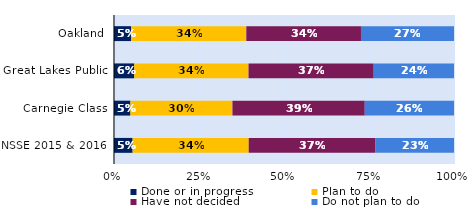
| Category | Done or in progress | Plan to do | Have not decided | Do not plan to do |
|---|---|---|---|---|
| Oakland | 0.05 | 0.339 | 0.337 | 0.274 |
| Great Lakes Public | 0.06 | 0.336 | 0.368 | 0.236 |
| Carnegie Class | 0.048 | 0.3 | 0.389 | 0.262 |
| NSSE 2015 & 2016 | 0.055 | 0.341 | 0.373 | 0.231 |